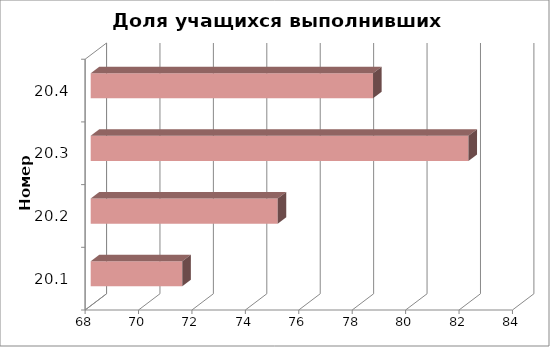
| Category | Доля учащихся выполнивших критерий |
|---|---|
| 20.1 | 71.429 |
| 20.2 | 75 |
| 20.3 | 82.143 |
| 20.4 | 78.571 |